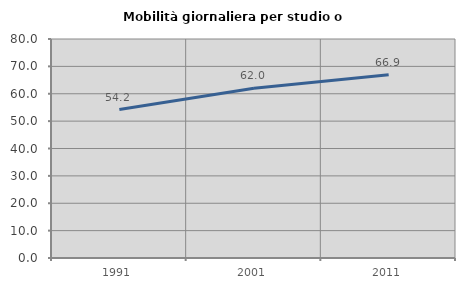
| Category | Mobilità giornaliera per studio o lavoro |
|---|---|
| 1991.0 | 54.224 |
| 2001.0 | 62.005 |
| 2011.0 | 66.919 |